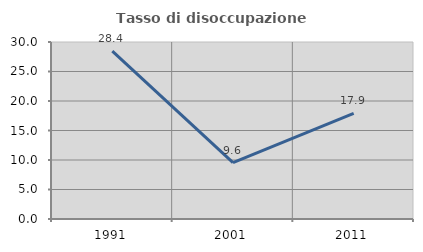
| Category | Tasso di disoccupazione giovanile  |
|---|---|
| 1991.0 | 28.448 |
| 2001.0 | 9.552 |
| 2011.0 | 17.901 |